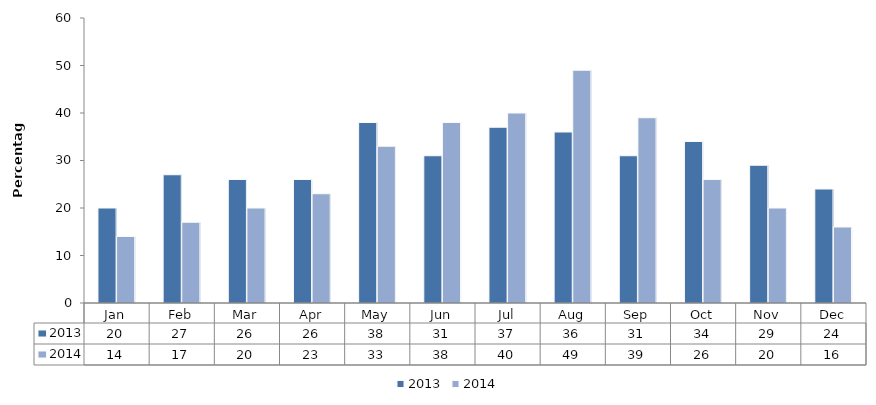
| Category | 2013 | 2014 |
|---|---|---|
| Jan | 20 | 14 |
| Feb | 27 | 17 |
| Mar | 26 | 20 |
| Apr | 26 | 23 |
| May | 38 | 33 |
| Jun | 31 | 38 |
| Jul | 37 | 40 |
| Aug | 36 | 49 |
| Sep | 31 | 39 |
| Oct | 34 | 26 |
| Nov | 29 | 20 |
| Dec | 24 | 16 |